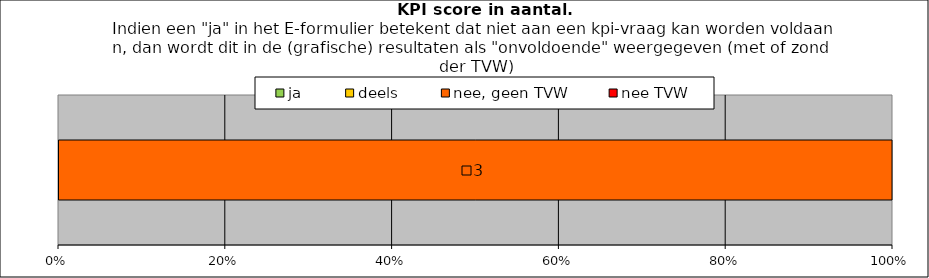
| Category | ja | deels | nee, geen TVW | nee TVW |
|---|---|---|---|---|
| 0 | 0 | 0 | 3 | 0 |